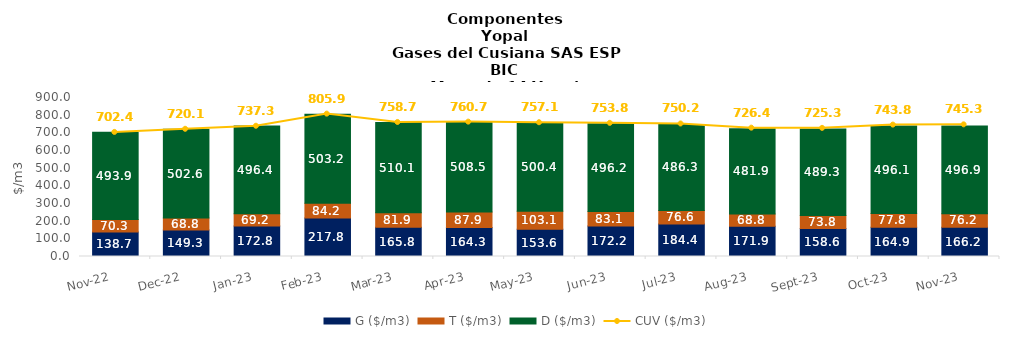
| Category | G ($/m3) | T ($/m3) | D ($/m3) |
|---|---|---|---|
| 2022-11-01 | 138.65 | 70.31 | 493.89 |
| 2022-12-01 | 149.33 | 68.76 | 502.55 |
| 2023-01-01 | 172.82 | 69.18 | 496.38 |
| 2023-02-01 | 217.82 | 84.19 | 503.15 |
| 2023-03-01 | 165.84 | 81.88 | 510.12 |
| 2023-04-01 | 164.25 | 87.89 | 508.45 |
| 2023-05-01 | 153.57 | 103.08 | 500.4 |
| 2023-06-01 | 172.16 | 83.07 | 496.23 |
| 2023-07-01 | 184.42 | 76.55 | 486.26 |
| 2023-08-01 | 171.91 | 68.78 | 481.89 |
| 2023-09-01 | 158.55 | 73.83 | 489.25 |
| 2023-10-01 | 164.94 | 77.79 | 496.13 |
| 2023-11-01 | 166.18 | 76.24 | 496.87 |